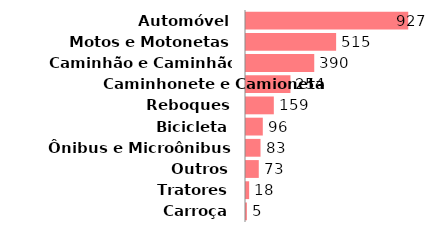
| Category | Qtde |
|---|---|
| Automóvel | 927 |
| Motos e Motonetas | 515 |
| Caminhão e Caminhão Trator | 390 |
| Caminhonete e Camioneta | 254 |
| Reboques | 159 |
| Bicicleta | 96 |
| Ônibus e Microônibus | 83 |
| Outros | 73 |
| Tratores | 18 |
| Carroça | 5 |